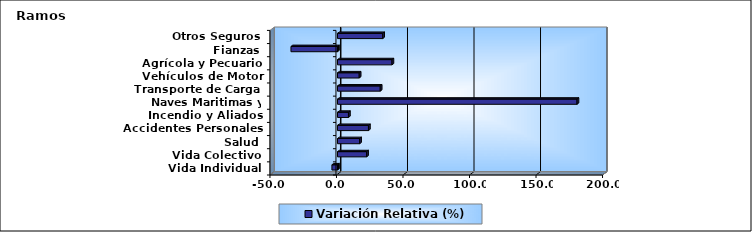
| Category | Variación Relativa (%) |
|---|---|
| Vida Individual | -4.195 |
| Vida Colectivo | 21.88 |
| Salud | 16.65 |
| Accidentes Personales | 23.273 |
| Incendio y Aliados | 8.244 |
| Naves Maritimas y Aéreas | 180.054 |
| Transporte de Carga | 32.128 |
| Vehículos de Motor | 16.324 |
| Agrícola y Pecuario | 40.946 |
| Fianzas | -34.99 |
| Otros Seguros | 33.986 |